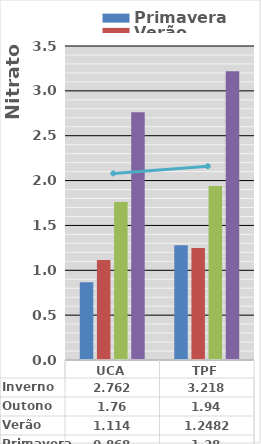
| Category | Primavera | Verão | Outono | Inverno |
|---|---|---|---|---|
| UCA | 0.868 | 1.114 | 1.76 | 2.762 |
| TPF | 1.28 | 1.248 | 1.94 | 3.218 |